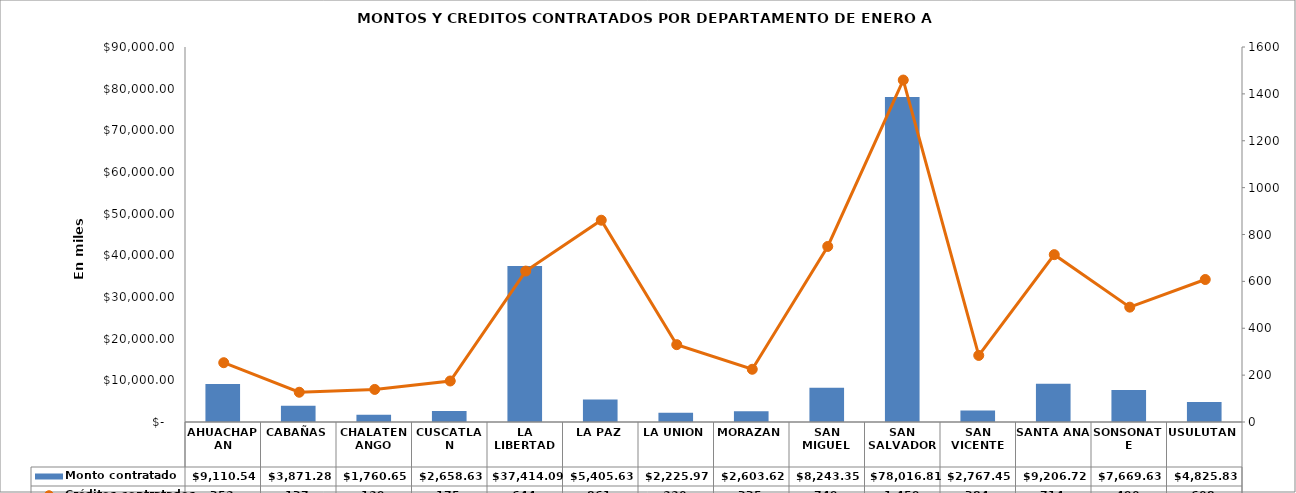
| Category | Monto contratado  |
|---|---|
| AHUACHAPAN | 9110.537 |
| CABAÑAS | 3871.282 |
| CHALATENANGO | 1760.652 |
| CUSCATLAN | 2658.634 |
| LA LIBERTAD | 37414.089 |
| LA PAZ | 5405.625 |
| LA UNION | 2225.967 |
| MORAZAN | 2603.62 |
| SAN MIGUEL | 8243.347 |
| SAN SALVADOR | 78016.809 |
| SAN VICENTE | 2767.453 |
| SANTA ANA | 9206.718 |
| SONSONATE | 7669.633 |
| USULUTAN | 4825.832 |